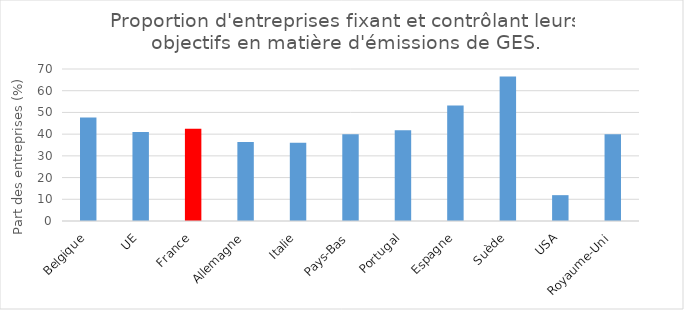
| Category | Proportion d'entreprises fixant et contrôlant leurs objectifs en matière d'émissions de GES. |
|---|---|
|   Belgique | 47.63 |
|   UE | 40.97 |
|   France | 42.49 |
|   Allemagne | 36.39 |
|   Italie | 36.07 |
|   Pays-Bas | 39.95 |
|   Portugal | 41.77 |
|   Espagne | 53.16 |
|   Suède | 66.51 |
|   USA | 11.9 |
| Royaume-Uni | 39.9 |